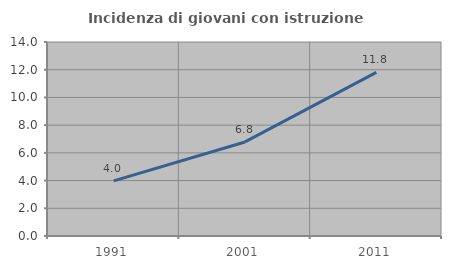
| Category | Incidenza di giovani con istruzione universitaria |
|---|---|
| 1991.0 | 3.979 |
| 2001.0 | 6.787 |
| 2011.0 | 11.807 |